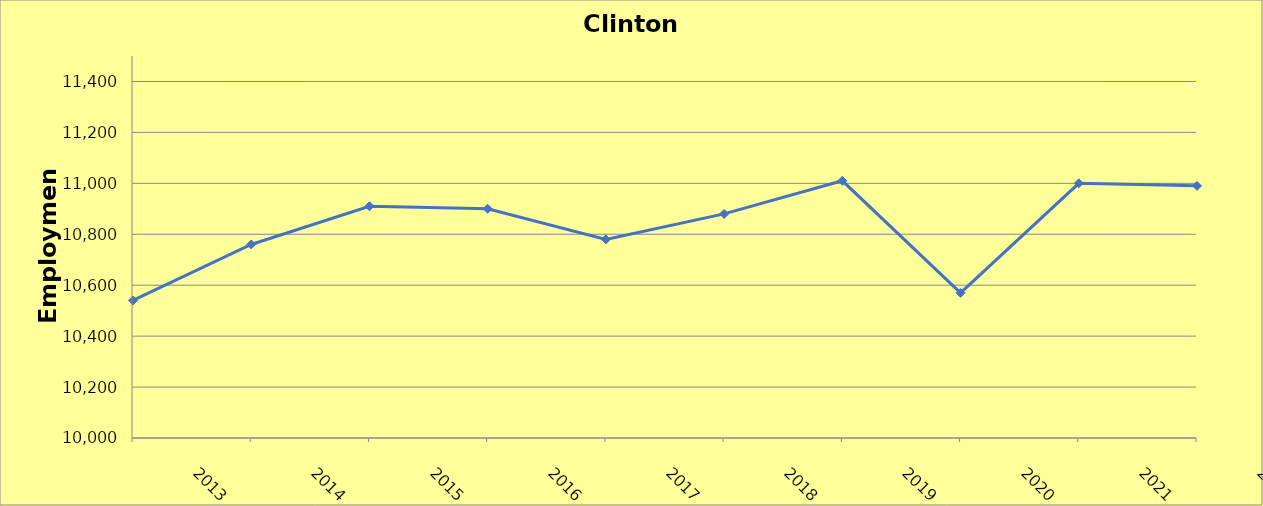
| Category | Clinton County |
|---|---|
| 2013.0 | 10540 |
| 2014.0 | 10760 |
| 2015.0 | 10910 |
| 2016.0 | 10900 |
| 2017.0 | 10780 |
| 2018.0 | 10880 |
| 2019.0 | 11010 |
| 2020.0 | 10570 |
| 2021.0 | 11000 |
| 2022.0 | 10990 |